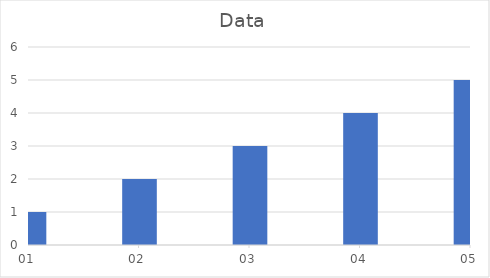
| Category | Data |
|---|---|
| 20.01.01. | 1 |
| 20.01.02. | 2 |
| 20.01.03. | 3 |
| 20.01.04. | 4 |
| 20.01.05. | 5 |